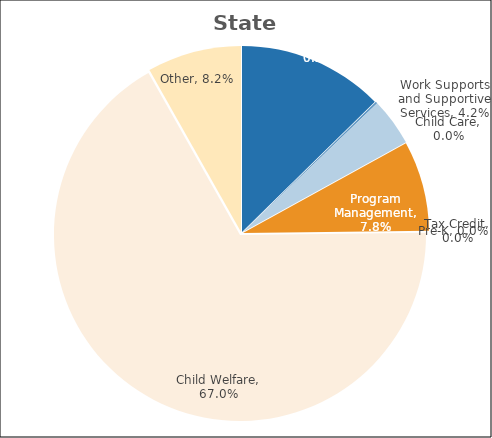
| Category | Series 0 |
|---|---|
| Basic Assistance | 0.127 |
| Work Activities | 0.002 |
| Work Supports and Supportive Services | 0.042 |
| Child Care | 0 |
| Program Management | 0.078 |
| Tax Credit | 0 |
| Pre-K | 0 |
| Child Welfare | 0.67 |
| Other | 0.082 |